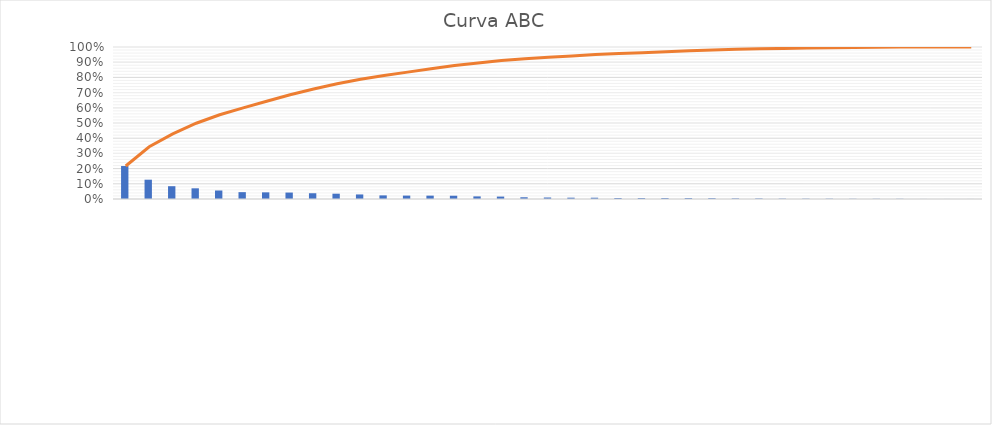
| Category | Series 0 |
|---|---|
| 0 | 0.217 |
| 1 | 0.127 |
| 2 | 0.084 |
| 3 | 0.07 |
| 4 | 0.056 |
| 5 | 0.045 |
| 6 | 0.044 |
| 7 | 0.042 |
| 8 | 0.038 |
| 9 | 0.035 |
| 10 | 0.03 |
| 11 | 0.024 |
| 12 | 0.022 |
| 13 | 0.022 |
| 14 | 0.022 |
| 15 | 0.017 |
| 16 | 0.016 |
| 17 | 0.011 |
| 18 | 0.01 |
| 19 | 0.009 |
| 20 | 0.008 |
| 21 | 0.007 |
| 22 | 0.006 |
| 23 | 0.006 |
| 24 | 0.006 |
| 25 | 0.005 |
| 26 | 0.004 |
| 27 | 0.004 |
| 28 | 0.002 |
| 29 | 0.002 |
| 30 | 0.002 |
| 31 | 0.001 |
| 32 | 0.001 |
| 33 | 0.001 |
| 34 | 0 |
| 35 | 0 |
| 36 | 0 |